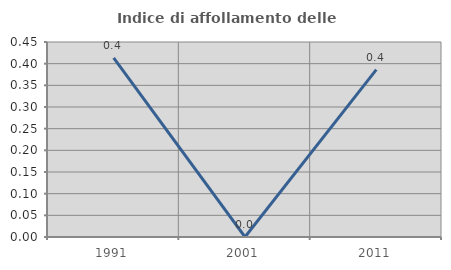
| Category | Indice di affollamento delle abitazioni  |
|---|---|
| 1991.0 | 0.413 |
| 2001.0 | 0 |
| 2011.0 | 0.386 |